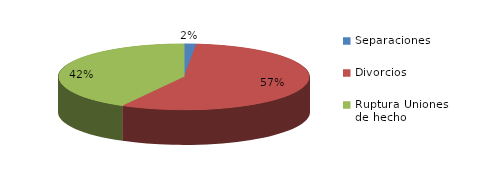
| Category | Series 0 |
|---|---|
| Separaciones | 22 |
| Divorcios | 819 |
| Ruptura Uniones de hecho | 607 |